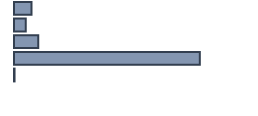
| Category | Percentatge |
|---|---|
| 0 | 7.273 |
| 1 | 4.924 |
| 2 | 10.152 |
| 3 | 77.424 |
| 4 | 0.227 |
| 5 | 0 |